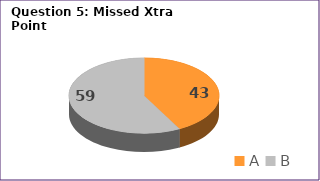
| Category | Series 0 |
|---|---|
| A | 43 |
| B | 59 |